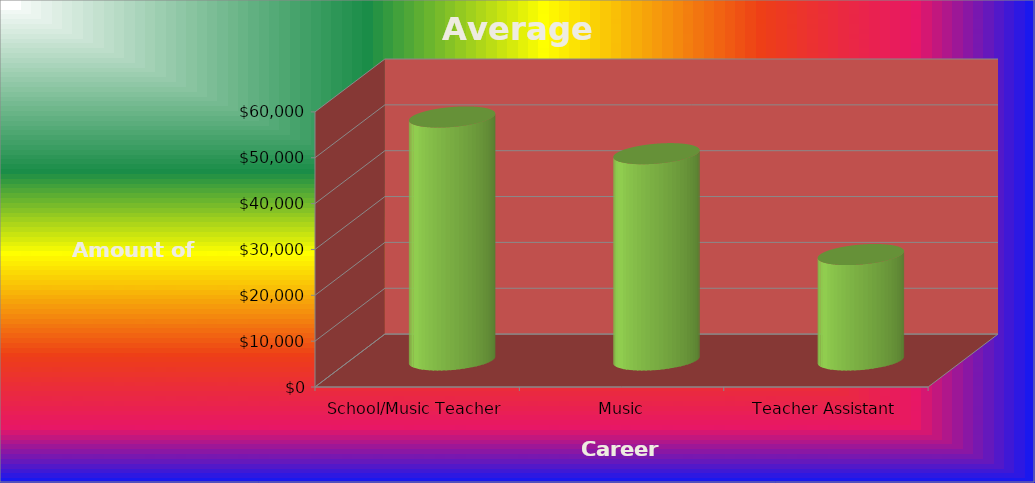
| Category | Series 0 |
|---|---|
| School/Music Teacher | 53000 |
| Music Arranger/Composer | 45000 |
| Teacher Assistant | 23000 |